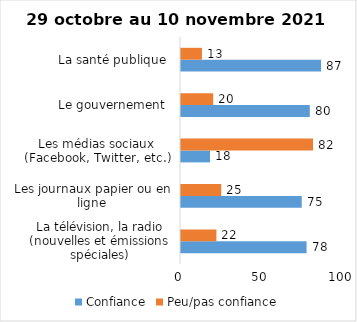
| Category | Confiance | Peu/pas confiance |
|---|---|---|
| La télévision, la radio (nouvelles et émissions spéciales) | 78 | 22 |
| Les journaux papier ou en ligne | 75 | 25 |
| Les médias sociaux (Facebook, Twitter, etc.) | 18 | 82 |
| Le gouvernement  | 80 | 20 |
| La santé publique  | 87 | 13 |